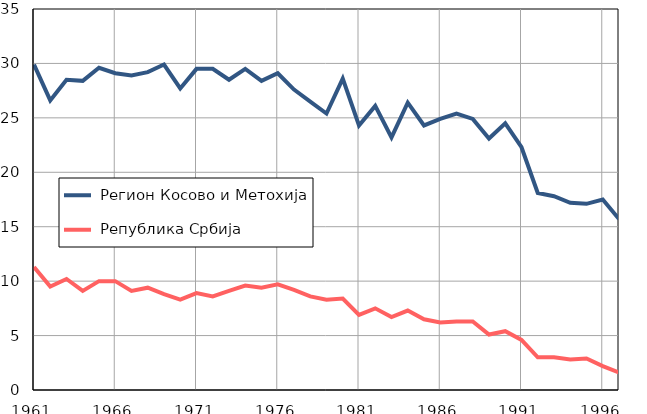
| Category |  Регион Косово и Метохија |  Република Србија |
|---|---|---|
| 1961.0 | 29.9 | 11.3 |
| 1962.0 | 26.6 | 9.5 |
| 1963.0 | 28.5 | 10.2 |
| 1964.0 | 28.4 | 9.1 |
| 1965.0 | 29.6 | 10 |
| 1966.0 | 29.1 | 10 |
| 1967.0 | 28.9 | 9.1 |
| 1968.0 | 29.2 | 9.4 |
| 1969.0 | 29.9 | 8.8 |
| 1970.0 | 27.7 | 8.3 |
| 1971.0 | 29.5 | 8.9 |
| 1972.0 | 29.5 | 8.6 |
| 1973.0 | 28.5 | 9.1 |
| 1974.0 | 29.5 | 9.6 |
| 1975.0 | 28.4 | 9.4 |
| 1976.0 | 29.1 | 9.7 |
| 1977.0 | 27.6 | 9.2 |
| 1978.0 | 26.5 | 8.6 |
| 1979.0 | 25.4 | 8.3 |
| 1980.0 | 28.6 | 8.4 |
| 1981.0 | 24.3 | 6.9 |
| 1982.0 | 26.1 | 7.5 |
| 1983.0 | 23.2 | 6.7 |
| 1984.0 | 26.4 | 7.3 |
| 1985.0 | 24.3 | 6.5 |
| 1986.0 | 24.9 | 6.2 |
| 1987.0 | 25.4 | 6.3 |
| 1988.0 | 24.9 | 6.3 |
| 1989.0 | 23.1 | 5.1 |
| 1990.0 | 24.5 | 5.4 |
| 1991.0 | 22.3 | 4.6 |
| 1992.0 | 18.1 | 3 |
| 1993.0 | 17.8 | 3 |
| 1994.0 | 17.2 | 2.8 |
| 1995.0 | 17.1 | 2.9 |
| 1996.0 | 17.5 | 2.2 |
| 1997.0 | 15.7 | 1.6 |